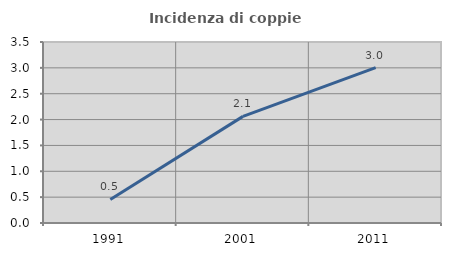
| Category | Incidenza di coppie miste |
|---|---|
| 1991.0 | 0.455 |
| 2001.0 | 2.062 |
| 2011.0 | 3.006 |